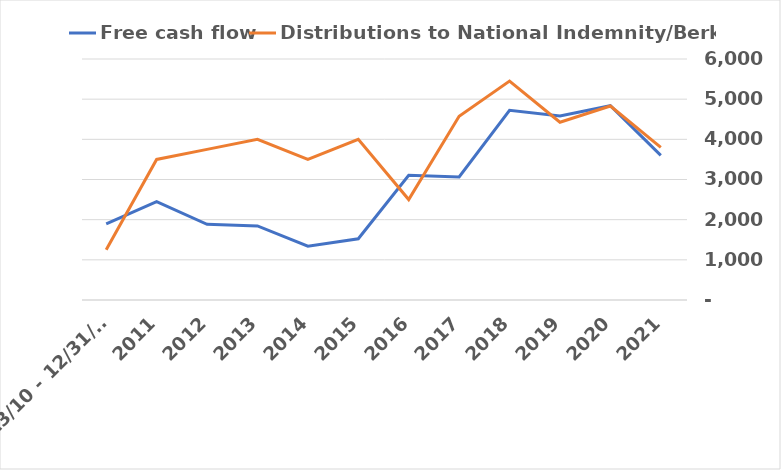
| Category | Free cash flow | Distributions to National Indemnity/Berkshire |
|---|---|---|
| 2021 | 3600 | 3800 |
| 2020 | 4837 | 4830 |
| 2019 | 4579 | 4425 |
| 2018 | 4721 | 5450 |
| 2017 | 3062 | 4575 |
| 2016 | 3106 | 2500 |
| 2015 | 1524 | 4000 |
| 2014 | 1338 | 3500 |
| 2013 | 1844 | 4000 |
| 2012 | 1885 | 3750 |
| 2011 | 2451 | 3500 |
| 2/13/10 - 12/31/10 | 1897 | 1250 |